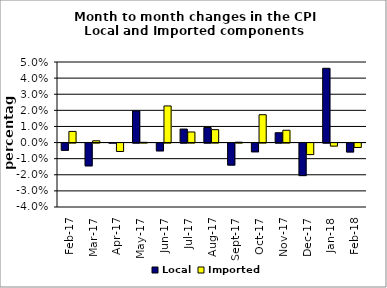
| Category | Local | Imported |
|---|---|---|
| 2017-02-01 | -0.004 | 0.007 |
| 2017-03-01 | -0.014 | 0.001 |
| 2017-04-01 | 0 | -0.005 |
| 2017-05-01 | 0.02 | 0 |
| 2017-06-01 | -0.005 | 0.023 |
| 2017-07-01 | 0.008 | 0.007 |
| 2017-08-01 | 0.009 | 0.008 |
| 2017-09-01 | -0.014 | 0 |
| 2017-10-01 | -0.005 | 0.017 |
| 2017-11-01 | 0.006 | 0.008 |
| 2017-12-01 | -0.02 | -0.007 |
| 2018-01-01 | 0.046 | -0.002 |
| 2018-02-01 | -0.006 | -0.003 |